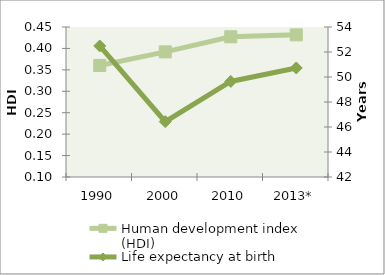
| Category | Human development index (HDI) |
|---|---|
| 1990 | 0.36 |
| 2000 | 0.392 |
| 2010 | 0.427 |
| 2013* | 0.432 |